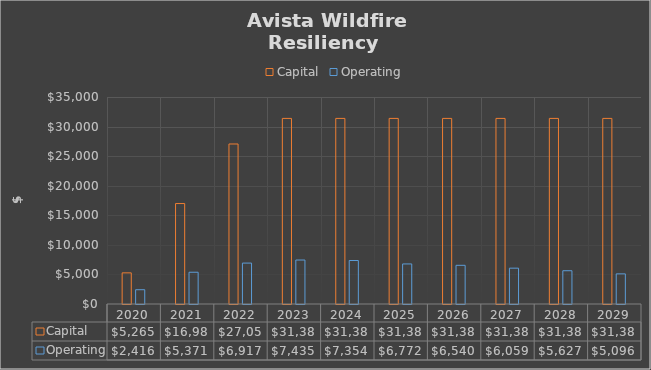
| Category | Capital | Operating |
|---|---|---|
| 2020.0 | 5265 | 2415.5 |
| 2021.0 | 16985 | 5370.867 |
| 2022.0 | 27055 | 6916.767 |
| 2023.0 | 31380 | 7435.167 |
| 2024.0 | 31380 | 7353.567 |
| 2025.0 | 31380 | 6771.967 |
| 2026.0 | 31380 | 6540.367 |
| 2027.0 | 31380 | 6058.767 |
| 2028.0 | 31380 | 5627.167 |
| 2029.0 | 31380 | 5096.067 |